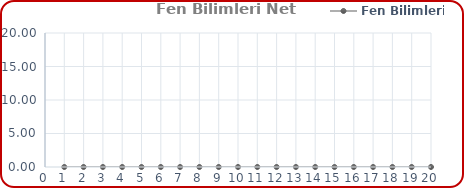
| Category | Fen Bilimleri |
|---|---|
| 0 | 0 |
| 1 | 0 |
| 2 | 0 |
| 3 | 0 |
| 4 | 0 |
| 5 | 0 |
| 6 | 0 |
| 7 | 0 |
| 8 | 0 |
| 9 | 0 |
| 10 | 0 |
| 11 | 0 |
| 12 | 0 |
| 13 | 0 |
| 14 | 0 |
| 15 | 0 |
| 16 | 0 |
| 17 | 0 |
| 18 | 0 |
| 19 | 0 |